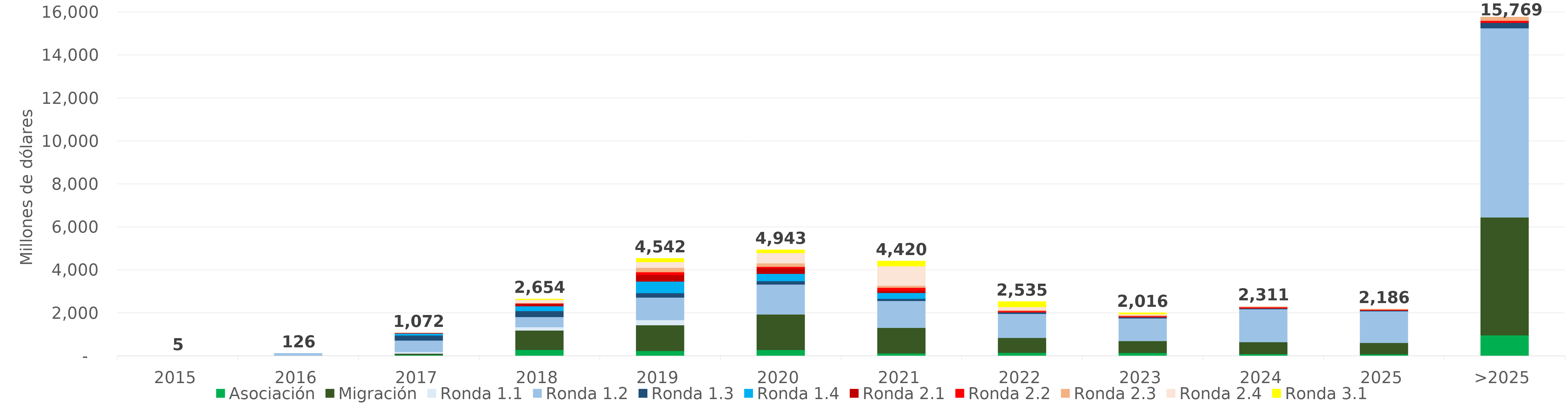
| Category | Asociación | Migración | Ronda 1.1 | Ronda 1.2 | Ronda 1.3 | Ronda 1.4 | Ronda 2.1 | Ronda 2.2 | Ronda 2.3 | Ronda 2.4 | Ronda 3.1 |
|---|---|---|---|---|---|---|---|---|---|---|---|
| 2015 | 0 | 0 | 4.573 | 0.236 | 0 | 0 | 0 | 0 | 0 | 0 | 0 |
| 2016 | 0 | 0 | 16.79 | 108.909 | 0 | 0 | 0 | 0 | 0 | 0 | 0 |
| 2017 | 50.877 | 65.422 | 76.429 | 533.486 | 231.789 | 93.443 | 18.851 | 1.29 | 0.72 | 0 | 0 |
| 2018 | 289.394 | 902.921 | 155.042 | 470.128 | 278.302 | 226.903 | 104.896 | 21.902 | 26.974 | 139.641 | 37.691 |
| 2019 | 241.207 | 1195.818 | 236.68 | 1049.68 | 207.126 | 540.649 | 302.09 | 133.009 | 199.161 | 270.262 | 166.186 |
| 2020 | 284.321 | 1655.641 | 6.736 | 1382.287 | 161.213 | 341.057 | 252.645 | 70.216 | 163.112 | 477.469 | 148.013 |
| 2021 | 127.797 | 1192.243 | 2.229 | 1245.799 | 97.796 | 274.593 | 106.762 | 132.813 | 98.223 | 902.96 | 238.989 |
| 2022 | 156.368 | 689.457 | 0 | 1116.823 | 55.367 | 10.69 | 22.691 | 47.813 | 42.421 | 142.246 | 250.81 |
| 2023 | 147.065 | 555.219 | 0 | 1053.188 | 52.504 | 0.73 | 0.019 | 52.984 | 42.971 | 47.441 | 63.845 |
| 2024 | 95.997 | 553.791 | 0 | 1533.703 | 34.867 | 0 | 0 | 56.582 | 34.555 | 1.529 | 0 |
| 2025 | 85.063 | 530.69 | 0 | 1469.047 | 35.989 | 0 | 0 | 35.777 | 29.075 | 0 | 0 |
| >2025 | 967.234 | 5485.433 | 0 | 8797.137 | 255.34 | 0 | 0 | 95.608 | 167.814 | 0 | 0 |